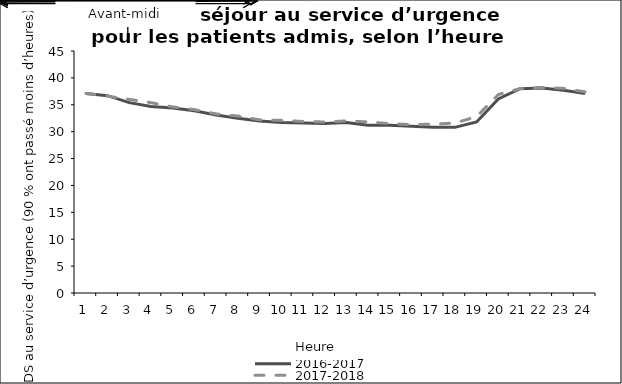
| Category | 2016-2017 | 2017-2018 |
|---|---|---|
| 0 | 37.1 | 37.1 |
| 1 | 36.7 | 36.6 |
| 2 | 35.4 | 36 |
| 3 | 34.7 | 35.4 |
| 4 | 34.4 | 34.6 |
| 5 | 33.9 | 34.1 |
| 6 | 33.1 | 33.3 |
| 7 | 32.5 | 32.9 |
| 8 | 32 | 32.2 |
| 9 | 31.7 | 32.1 |
| 10 | 31.6 | 31.9 |
| 11 | 31.5 | 31.8 |
| 12 | 31.7 | 32 |
| 13 | 31.2 | 31.8 |
| 14 | 31.2 | 31.5 |
| 15 | 31 | 31.3 |
| 16 | 30.8 | 31.4 |
| 17 | 30.8 | 31.6 |
| 18 | 31.8 | 32.8 |
| 19 | 36.1 | 36.9 |
| 20 | 38 | 38 |
| 21 | 38.1 | 38.2 |
| 22 | 37.7 | 38.06 |
| 23 | 37.1 | 37.4 |